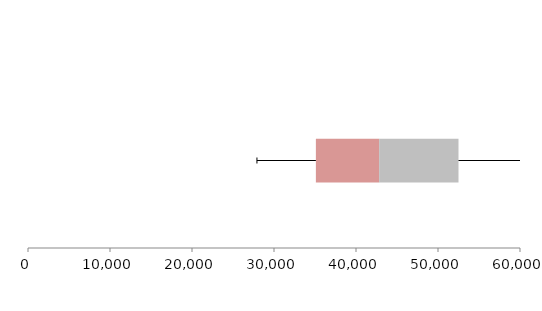
| Category | Series 1 | Series 2 | Series 3 |
|---|---|---|---|
| 0 | 35108.106 | 7714.363 | 9676.381 |